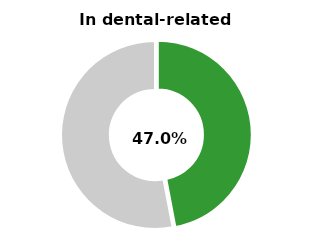
| Category | Series 0 |
|---|---|
| In dental-related activity | 0.47 |
| Other | 0.53 |